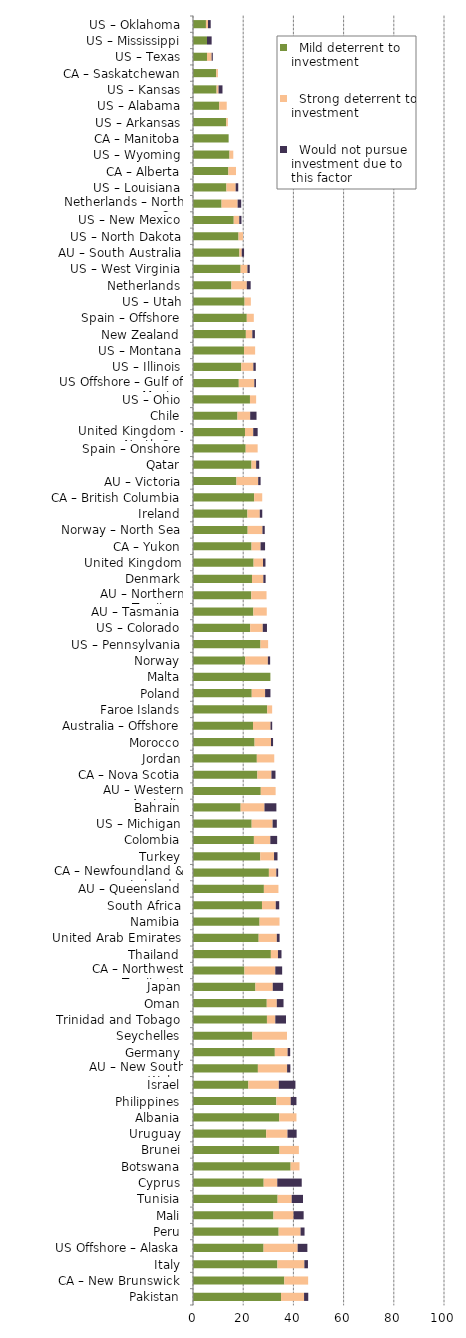
| Category |   Mild deterrent to investment |   Strong deterrent to investment |   Would not pursue investment due to this factor |
|---|---|---|---|
| Pakistan | 35.064 | 9.184 | 1.67 |
| CA – New Brunswick | 36.383 | 9.491 | 0 |
| Italy | 33.633 | 10.734 | 1.431 |
| US Offshore – Alaska | 28.116 | 13.573 | 3.878 |
| Peru | 34.122 | 8.729 | 1.587 |
| Mali | 32.059 | 8.015 | 4.007 |
| Tunisia | 33.707 | 5.618 | 4.494 |
| Cyprus | 28.16 | 5.415 | 9.748 |
| Botswana | 38.895 | 3.536 | 0 |
| Brunei | 34.449 | 7.733 | 0 |
| Uruguay | 29.144 | 8.5 | 3.643 |
| Albania | 34.349 | 6.87 | 0 |
| Philippines | 33.204 | 5.725 | 2.29 |
| Israel | 22.059 | 12.132 | 6.618 |
| AU – New South Wales | 25.854 | 11.634 | 1.293 |
| Germany | 32.602 | 5.094 | 1.019 |
| Seychelles | 23.65 | 13.796 | 0 |
| Trinidad and Tobago | 29.461 | 3.326 | 4.277 |
| Oman | 29.387 | 4.007 | 2.672 |
| Japan | 24.873 | 6.909 | 4.146 |
| CA – Northwest Territories | 20.492 | 12.295 | 2.732 |
| Thailand | 31.025 | 2.82 | 1.41 |
| United Arab Emirates | 26.159 | 7.235 | 1.113 |
| Namibia | 26.519 | 7.956 | 0 |
| South Africa | 27.479 | 5.496 | 1.374 |
| AU – Queensland | 28.245 | 5.794 | 0 |
| CA – Newfoundland & Labrador | 30.24 | 2.95 | 0.738 |
| Turkey | 26.792 | 5.496 | 1.374 |
| Colombia | 24.262 | 6.543 | 2.726 |
| US – Michigan | 23.376 | 8.349 | 1.67 |
| Bahrain | 18.982 | 9.491 | 4.746 |
| AU – Western Australia | 27.003 | 5.919 | 0 |
| CA – Nova Scotia | 25.647 | 5.61 | 1.603 |
| Jordan | 25.431 | 6.936 | 0 |
| Morocco | 24.535 | 6.543 | 0.818 |
| Australia – Offshore | 23.911 | 6.974 | 0.664 |
| Faroe Islands | 29.562 | 1.971 | 0 |
| Poland | 23.406 | 5.319 | 2.128 |
| Malta | 30.826 | 0 | 0 |
| Norway | 20.79 | 9.039 | 0.904 |
| US – Pennsylvania | 26.885 | 3.044 | 0 |
| US – Colorado | 22.772 | 5.023 | 1.674 |
| AU – Tasmania | 24.044 | 5.343 | 0 |
| AU – Northern Territory | 23.236 | 6.062 | 0 |
| Denmark | 23.502 | 4.52 | 0.904 |
| United Kingdom | 24.144 | 3.734 | 0.996 |
| CA – Yukon | 23.326 | 3.589 | 1.794 |
| Norway – North Sea | 21.776 | 5.898 | 0.907 |
| Ireland | 21.679 | 4.927 | 0.985 |
| CA – British Columbia | 24.365 | 3.213 | 0 |
| AU – Victoria | 17.312 | 8.656 | 0.962 |
| Qatar | 23.308 | 1.84 | 1.227 |
| Spain – Onshore | 20.991 | 4.771 | 0 |
| United Kingdom – North Sea | 20.71 | 3.283 | 1.768 |
| Chile | 17.717 | 5.062 | 2.531 |
| US – Ohio | 22.695 | 2.453 | 0 |
| US Offshore – Gulf of Mexico | 18.245 | 6.19 | 0.652 |
| US – Illinois | 19.235 | 4.809 | 0.962 |
| US – Montana | 20.331 | 4.42 | 0 |
| New Zealand | 21.064 | 2.569 | 1.028 |
| Spain – Offshore | 21.435 | 2.796 | 0 |
| US – Utah | 20.556 | 2.492 | 0 |
| Netherlands | 15.315 | 6.126 | 1.531 |
| US – West Virginia | 18.982 | 2.712 | 0.904 |
| AU – South Australia | 18.495 | 0.925 | 0.925 |
| US – North Dakota | 18.14 | 1.778 | 0 |
| US – New Mexico | 16.234 | 2.194 | 0.878 |
| Netherlands – North Sea | 11.382 | 6.402 | 1.423 |
| US – Louisiana | 13.312 | 3.686 | 1.024 |
| CA – Alberta | 14.095 | 3.04 | 0 |
| US – Wyoming | 14.535 | 1.514 | 0 |
| CA – Manitoba | 14.199 | 0 | 0 |
| US – Arkansas | 13.211 | 0.661 | 0 |
| US – Alabama | 10.454 | 2.987 | 0 |
| US – Kansas | 9.398 | 0.783 | 1.566 |
| CA – Saskatchewan | 9.22 | 0.709 | 0 |
| US – Texas | 5.57 | 1.857 | 0.464 |
| US – Mississippi | 5.57 | 0 | 1.857 |
| US – Oklahoma | 5.156 | 0.814 | 1.086 |